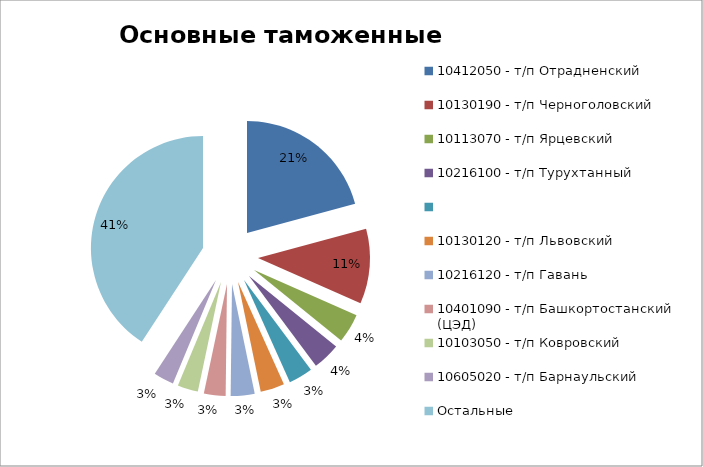
| Category | Стоимость, USD |
|---|---|
| 10412050 - т/п Отрадненский | 3920529.81 |
| 10130190 - т/п Черноголовский | 2040627.77 |
| 10113070 - т/п Ярцевский | 794758.15 |
| 10216100 - т/п Турухтанный | 753623.4 |
|  | 654292.19 |
| 10130120 - т/п Львовский | 653501.8 |
| 10216120 - т/п Гавань | 650442.53 |
| 10401090 - т/п Башкортостанский (ЦЭД) | 589870 |
| 10103050 - т/п Ковровский | 559636.1 |
| 10605020 - т/п Барнаульский | 550130 |
| Остальные | 7695868.43 |